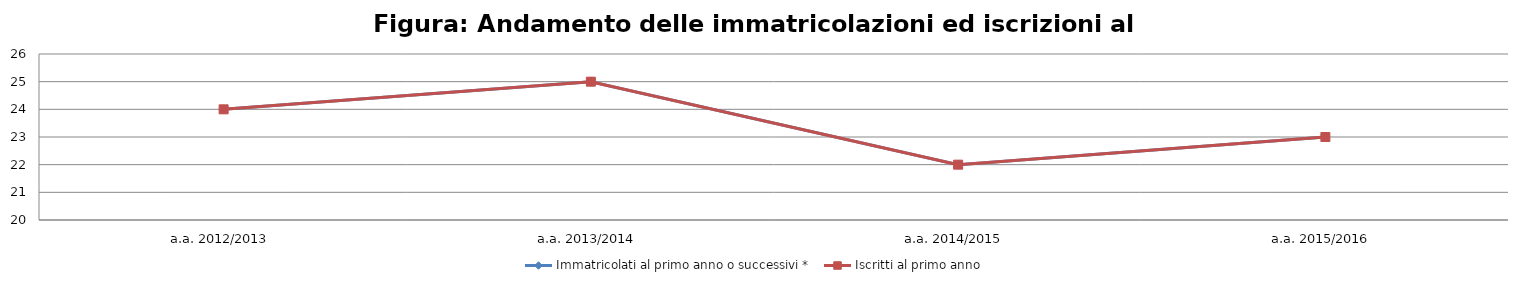
| Category | Immatricolati al primo anno o successivi * | Iscritti al primo anno  |
|---|---|---|
| a.a. 2012/2013 | 24 | 24 |
| a.a. 2013/2014 | 25 | 25 |
| a.a. 2014/2015 | 22 | 22 |
| a.a. 2015/2016 | 23 | 23 |